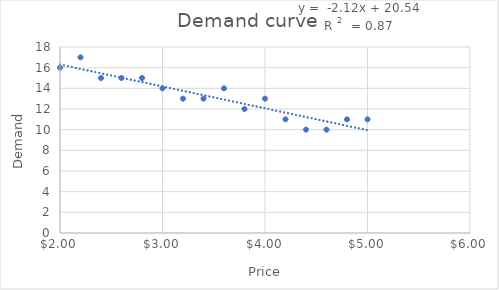
| Category | Demand |
|---|---|
| 2.0 | 16 |
| 2.2 | 17 |
| 2.4 | 15 |
| 2.6 | 15 |
| 2.8 | 15 |
| 3.0 | 14 |
| 3.2 | 13 |
| 3.4 | 13 |
| 3.6 | 14 |
| 3.8 | 12 |
| 4.0 | 13 |
| 4.2 | 11 |
| 4.4 | 10 |
| 4.6 | 10 |
| 4.8 | 11 |
| 5.0 | 11 |